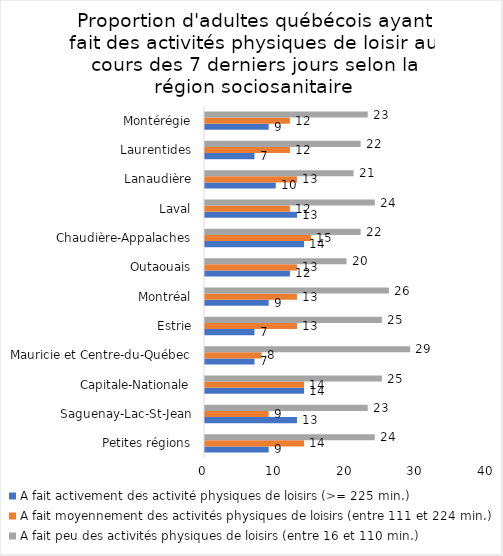
| Category | A fait activement des activité physiques de loisirs (>= 225 min.) | A fait moyennement des activités physiques de loisirs (entre 111 et 224 min.) | A fait peu des activités physiques de loisirs (entre 16 et 110 min.) |
|---|---|---|---|
| Petites régions | 9 | 14 | 24 |
| Saguenay-Lac-St-Jean | 13 | 9 | 23 |
| Capitale-Nationale | 14 | 14 | 25 |
| Mauricie et Centre-du-Québec | 7 | 8 | 29 |
| Estrie | 7 | 13 | 25 |
| Montréal | 9 | 13 | 26 |
| Outaouais | 12 | 13 | 20 |
| Chaudière-Appalaches | 14 | 15 | 22 |
| Laval | 13 | 12 | 24 |
| Lanaudière | 10 | 13 | 21 |
| Laurentides | 7 | 12 | 22 |
| Montérégie | 9 | 12 | 23 |